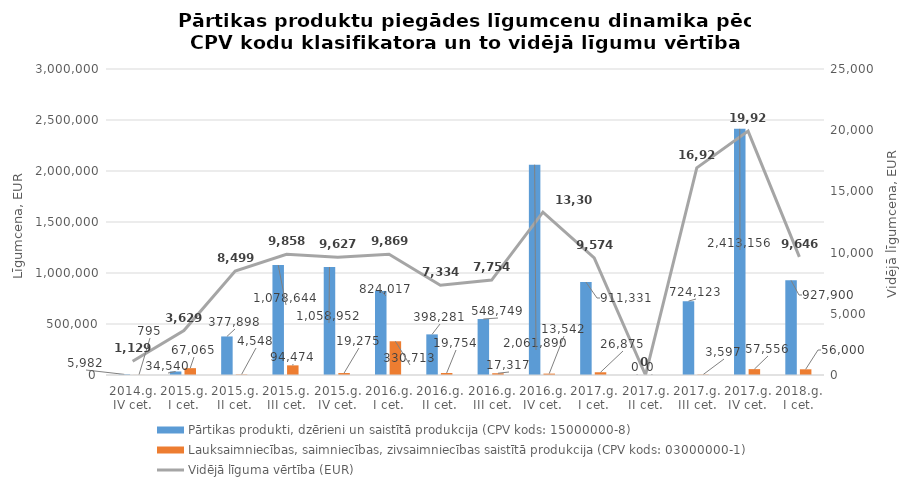
| Category | Pārtikas produkti, dzērieni un saistītā produkcija (CPV kods: 15000000-8) | Lauksaimniecības, saimniecības, zivsaimniecības saistītā produkcija (CPV kods: 03000000-1) |
|---|---|---|
| 2014.g. IV cet. | 5982 | 795 |
| 2015.g. I cet. | 34540 | 67065 |
| 2015.g. II cet. | 377898 | 4548 |
| 2015.g. III cet. | 1078644 | 94474 |
| 2015.g. IV cet. | 1058952 | 19275 |
| 2016.g. I cet. | 824017 | 330713 |
| 2016.g. II cet. | 398281 | 19754 |
| 2016.g. III cet. | 548749.01 | 17317 |
| 2016.g. IV cet. | 2061890 | 13542 |
| 2017.g. I cet. | 911330.81 | 26874.91 |
| 2017.g. II cet. | 0 | 0 |
| 2017.g. III cet. | 724123.07 | 3596.6 |
| 2017.g. IV cet. | 2413156 | 57556 |
| 2018.g. I cet. | 927900 | 56000 |